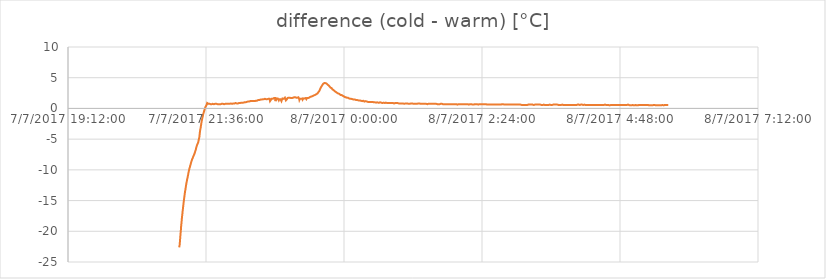
| Category | difference (cold - warm) [°C] |
|---|---|
| 42923.88056712963 | -22.62 |
| 42923.880740740744 | -22.69 |
| 42923.88092592593 | -22.19 |
| 42923.88109953704 | -21.69 |
| 42923.881273148145 | -21.19 |
| 42923.88144675926 | -20.69 |
| 42923.881631944445 | -20.19 |
| 42923.88180555555 | -19.75 |
| 42923.88197916667 | -19.19 |
| 42923.88217592592 | -18.75 |
| 42923.882361111115 | -18.31 |
| 42923.88253472222 | -17.87 |
| 42923.88270833333 | -17.5 |
| 42923.88290509259 | -17.12 |
| 42923.88309027778 | -16.69 |
| 42923.883263888885 | -16.37 |
| 42923.8834375 | -16 |
| 42923.88363425926 | -15.63 |
| 42923.88381944445 | -15.25 |
| 42923.883993055555 | -14.94 |
| 42923.88416666666 | -14.63 |
| 42923.884363425925 | -14.31 |
| 42923.88454861111 | -14 |
| 42923.884722222225 | -13.69 |
| 42923.88489583333 | -13.44 |
| 42923.88506944444 | -13.25 |
| 42923.88525462963 | -12.94 |
| 42923.88542824074 | -12.69 |
| 42923.88560185185 | -12.44 |
| 42923.885787037034 | -12.19 |
| 42923.88596064815 | -12 |
| 42923.88613425926 | -11.81 |
| 42923.88630787037 | -11.56 |
| 42923.88649305556 | -11.44 |
| 42923.886666666665 | -11.25 |
| 42923.88684027778 | -11 |
| 42923.887037037035 | -10.81 |
| 42923.88722222222 | -10.56 |
| 42923.887395833335 | -10.38 |
| 42923.88756944444 | -10.19 |
| 42923.887766203705 | -10 |
| 42923.88795138889 | -9.81 |
| 42923.888125 | -9.69 |
| 42923.88829861111 | -9.56 |
| 42923.8884837963 | -9.38 |
| 42923.888657407406 | -9.25 |
| 42923.88883101852 | -9.13 |
| 42923.88900462963 | -9 |
| 42923.889189814814 | -8.81 |
| 42923.88936342593 | -8.69 |
| 42923.88953703704 | -8.56 |
| 42923.889710648145 | -8.44 |
| 42923.88989583333 | -8.31 |
| 42923.890069444446 | -8.25 |
| 42923.89024305555 | -8.19 |
| 42923.89042824074 | -8.06 |
| 42923.890601851854 | -7.94 |
| 42923.89077546296 | -7.81 |
| 42923.89094907408 | -7.75 |
| 42923.89113425926 | -7.69 |
| 42923.89130787037 | -7.56 |
| 42923.89148148148 | -7.5 |
| 42923.89165509259 | -7.37 |
| 42923.89184027778 | -7.31 |
| 42923.892013888886 | -7.12 |
| 42923.8921875 | -7 |
| 42923.892372685186 | -6.87 |
| 42923.892546296294 | -6.75 |
| 42923.89271990741 | -6.62 |
| 42923.892916666664 | -6.37 |
| 42923.89310185185 | -6.31 |
| 42923.893275462964 | -6.12 |
| 42923.89344907407 | -6 |
| 42923.893645833334 | -5.87 |
| 42923.893842592595 | -5.81 |
| 42923.89402777778 | -5.69 |
| 42923.89420138889 | -5.56 |
| 42923.894375 | -5.5 |
| 42923.89454861111 | -5.31 |
| 42923.894733796296 | -5.19 |
| 42923.894907407404 | -4.94 |
| 42923.89509259259 | -4.75 |
| 42923.895266203705 | -4.56 |
| 42923.89543981481 | -4.12 |
| 42923.89561342593 | -3.81 |
| 42923.89579861111 | -3.5 |
| 42923.89597222222 | -3.31 |
| 42923.896145833336 | -3.12 |
| 42923.89634259259 | -2.81 |
| 42923.896516203706 | -2.56 |
| 42923.896689814814 | -2.31 |
| 42923.896886574075 | -2.06 |
| 42923.89707175926 | -1.87 |
| 42923.89724537037 | -1.69 |
| 42923.89741898148 | -1.5 |
| 42923.89760416667 | -1.31 |
| 42923.89778935185 | -1.12 |
| 42923.89796296296 | -0.94 |
| 42923.89815972222 | -0.81 |
| 42923.89834490741 | -0.69 |
| 42923.898518518516 | -0.5 |
| 42923.8987037037 | -0.37 |
| 42923.898888888885 | -0.25 |
| 42923.8990625 | -0.13 |
| 42923.89923611111 | 0 |
| 42923.899409722224 | 0.13 |
| 42923.89959490741 | 0.25 |
| 42923.89976851852 | 0.25 |
| 42923.89994212963 | 0.31 |
| 42923.90012731482 | 0.44 |
| 42923.9003125 | 0.5 |
| 42923.90048611111 | 0.62 |
| 42923.900671296295 | 0.75 |
| 42923.900868055556 | 0.88 |
| 42923.901041666664 | 0.94 |
| 42923.90121527778 | 0.88 |
| 42923.90138888889 | 0.81 |
| 42923.90157407407 | 0.75 |
| 42923.90175925926 | 0.75 |
| 42923.90193287037 | 0.75 |
| 42923.90211805556 | 0.75 |
| 42923.902291666665 | 0.75 |
| 42923.90246527778 | 0.75 |
| 42923.902662037035 | 0.75 |
| 42923.9028587963 | 0.75 |
| 42923.90304398148 | 0.69 |
| 42923.90321759259 | 0.69 |
| 42923.903391203705 | 0.69 |
| 42923.90357638889 | 0.69 |
| 42923.903761574074 | 0.69 |
| 42923.90393518518 | 0.69 |
| 42923.90412037037 | 0.69 |
| 42923.90430555555 | 0.69 |
| 42923.904490740744 | 0.69 |
| 42923.90466435185 | 0.75 |
| 42923.90484953704 | 0.75 |
| 42923.905023148145 | 0.69 |
| 42923.90519675926 | 0.69 |
| 42923.90539351852 | 0.69 |
| 42923.90556712963 | 0.69 |
| 42923.90574074074 | 0.69 |
| 42923.9059375 | 0.75 |
| 42923.90611111111 | 0.75 |
| 42923.90628472222 | 0.69 |
| 42923.90645833333 | 0.75 |
| 42923.906643518516 | 0.75 |
| 42923.90681712963 | 0.75 |
| 42923.907002314816 | 0.75 |
| 42923.907175925924 | 0.75 |
| 42923.90734953704 | 0.75 |
| 42923.90752314815 | 0.75 |
| 42923.90771990741 | 0.75 |
| 42923.90789351852 | 0.75 |
| 42923.90806712963 | 0.75 |
| 42923.90824074074 | 0.75 |
| 42923.9084375 | 0.69 |
| 42923.90862268519 | 0.69 |
| 42923.908796296295 | 0.69 |
| 42923.90896990741 | 0.69 |
| 42923.909166666665 | 0.69 |
| 42923.90935185185 | 0.69 |
| 42923.909525462965 | 0.69 |
| 42923.90969907407 | 0.69 |
| 42923.909895833334 | 0.69 |
| 42923.91008101852 | 0.69 |
| 42923.91025462963 | 0.69 |
| 42923.91042824074 | 0.69 |
| 42923.910625 | 0.69 |
| 42923.91081018518 | 0.69 |
| 42923.9109837963 | 0.69 |
| 42923.91118055556 | 0.75 |
| 42923.91136574074 | 0.75 |
| 42923.91153935185 | 0.75 |
| 42923.91171296296 | 0.75 |
| 42923.911886574075 | 0.75 |
| 42923.91207175926 | 0.69 |
| 42923.91224537037 | 0.75 |
| 42923.91241898148 | 0.75 |
| 42923.91259259259 | 0.69 |
| 42923.91278935185 | 0.69 |
| 42923.91296296296 | 0.75 |
| 42923.91315972222 | 0.69 |
| 42923.91334490741 | 0.69 |
| 42923.913518518515 | 0.69 |
| 42923.91369212963 | 0.75 |
| 42923.91386574074 | 0.69 |
| 42923.91405092592 | 0.75 |
| 42923.91422453704 | 0.75 |
| 42923.91439814815 | 0.75 |
| 42923.91457175926 | 0.75 |
| 42923.91475694445 | 0.75 |
| 42923.914930555555 | 0.75 |
| 42923.915127314816 | 0.75 |
| 42923.915300925924 | 0.69 |
| 42923.91548611111 | 0.75 |
| 42923.91568287037 | 0.75 |
| 42923.91585648148 | 0.75 |
| 42923.916041666664 | 0.75 |
| 42923.91622685185 | 0.75 |
| 42923.91641203704 | 0.75 |
| 42923.916597222225 | 0.75 |
| 42923.91678240741 | 0.75 |
| 42923.916967592595 | 0.75 |
| 42923.9171412037 | 0.75 |
| 42923.91732638889 | 0.75 |
| 42923.9175 | 0.75 |
| 42923.91767361111 | 0.81 |
| 42923.91784722222 | 0.81 |
| 42923.918020833335 | 0.81 |
| 42923.91819444444 | 0.75 |
| 42923.91836805556 | 0.81 |
| 42923.918541666666 | 0.81 |
| 42923.91871527778 | 0.75 |
| 42923.918900462966 | 0.75 |
| 42923.919074074074 | 0.75 |
| 42923.91924768518 | 0.75 |
| 42923.91943287037 | 0.75 |
| 42923.91961805556 | 0.81 |
| 42923.91979166667 | 0.81 |
| 42923.919965277775 | 0.75 |
| 42923.92015046296 | 0.81 |
| 42923.920324074075 | 0.81 |
| 42923.92050925926 | 0.81 |
| 42923.92068287037 | 0.81 |
| 42923.92087962963 | 0.81 |
| 42923.921064814815 | 0.81 |
| 42923.92123842592 | 0.81 |
| 42923.92141203704 | 0.88 |
| 42923.921585648146 | 0.81 |
| 42923.92175925926 | 0.88 |
| 42923.92193287037 | 0.81 |
| 42923.922106481485 | 0.81 |
| 42923.92229166667 | 0.81 |
| 42923.92246527778 | 0.81 |
| 42923.922638888886 | 0.81 |
| 42923.9228125 | 0.75 |
| 42923.92298611111 | 0.81 |
| 42923.923171296294 | 0.81 |
| 42923.92335648148 | 0.81 |
| 42923.92355324074 | 0.81 |
| 42923.923738425925 | 0.81 |
| 42923.92392361111 | 0.88 |
| 42923.92412037037 | 0.88 |
| 42923.924305555556 | 0.88 |
| 42923.924479166664 | 0.88 |
| 42923.92465277778 | 0.88 |
| 42923.924849537034 | 0.81 |
| 42923.92502314815 | 0.81 |
| 42923.92519675926 | 0.88 |
| 42923.92537037037 | 0.94 |
| 42923.92556712963 | 0.94 |
| 42923.92575231481 | 0.94 |
| 42923.92592592593 | 0.94 |
| 42923.926099537035 | 0.94 |
| 42923.9262962963 | 0.94 |
| 42923.92649305556 | 0.94 |
| 42923.92667824074 | 0.94 |
| 42923.92685185185 | 0.94 |
| 42923.92704861111 | 0.94 |
| 42923.9272337963 | 1 |
| 42923.927407407406 | 1 |
| 42923.92758101852 | 1 |
| 42923.92775462963 | 1 |
| 42923.927928240744 | 1 |
| 42923.92810185185 | 1 |
| 42923.928298611114 | 1 |
| 42923.9284837963 | 1 |
| 42923.92865740741 | 1 |
| 42923.92883101852 | 1 |
| 42923.92901620371 | 1 |
| 42923.92920138889 | 1.06 |
| 42923.929375 | 1.06 |
| 42923.92957175926 | 1.06 |
| 42923.929756944446 | 1.06 |
| 42923.929930555554 | 1.12 |
| 42923.93011574074 | 1.12 |
| 42923.930300925924 | 1.12 |
| 42923.93047453704 | 1.12 |
| 42923.93064814815 | 1.12 |
| 42923.93082175926 | 1.06 |
| 42923.93099537037 | 1.06 |
| 42923.93116898148 | 1.12 |
| 42923.931342592594 | 1.12 |
| 42923.93152777778 | 1.12 |
| 42923.93170138889 | 1.12 |
| 42923.931875 | 1.12 |
| 42923.932071759256 | 1.19 |
| 42923.93225694444 | 1.12 |
| 42923.93243055556 | 1.12 |
| 42923.932604166665 | 1.12 |
| 42923.93278935185 | 1.12 |
| 42923.932962962965 | 1.19 |
| 42923.93313657407 | 1.19 |
| 42923.93331018519 | 1.19 |
| 42923.93350694444 | 1.19 |
| 42923.93369212963 | 1.19 |
| 42923.93386574074 | 1.19 |
| 42923.93403935185 | 1.19 |
| 42923.934224537035 | 1.19 |
| 42923.93439814815 | 1.19 |
| 42923.93457175926 | 1.19 |
| 42923.93476851852 | 1.19 |
| 42923.93493055556 | 1.25 |
| 42923.93510416667 | 1.25 |
| 42923.93530092593 | 1.19 |
| 42923.93548611111 | 1.19 |
| 42923.93565972222 | 1.25 |
| 42923.93583333334 | 1.25 |
| 42923.936006944445 | 1.25 |
| 42923.93618055555 | 1.25 |
| 42923.93636574074 | 1.25 |
| 42923.93653935185 | 1.25 |
| 42923.93672453704 | 1.25 |
| 42923.93690972222 | 1.25 |
| 42923.93709490741 | 1.25 |
| 42923.937268518515 | 1.25 |
| 42923.9374537037 | 1.31 |
| 42923.937627314815 | 1.31 |
| 42923.93780092592 | 1.37 |
| 42923.93797453704 | 1.31 |
| 42923.938159722224 | 1.31 |
| 42923.93833333333 | 1.37 |
| 42923.93850694445 | 1.37 |
| 42923.93869212963 | 1.37 |
| 42923.93886574074 | 1.44 |
| 42923.939039351855 | 1.44 |
| 42923.93921296296 | 1.5 |
| 42923.93938657407 | 1.44 |
| 42923.939571759256 | 1.44 |
| 42923.93974537037 | 1.5 |
| 42923.93991898148 | 1.5 |
| 42923.940104166664 | 1.44 |
| 42923.94027777778 | 1.44 |
| 42923.94045138889 | 1.44 |
| 42923.94064814815 | 1.5 |
| 42923.940833333334 | 1.5 |
| 42923.94101851852 | 1.44 |
| 42923.941203703704 | 1.5 |
| 42923.941400462965 | 1.5 |
| 42923.94158564815 | 1.5 |
| 42923.94175925926 | 1.44 |
| 42923.94193287037 | 1.5 |
| 42923.94212962963 | 1.5 |
| 42923.94231481481 | 1.5 |
| 42923.94248842593 | 1.5 |
| 42923.942662037036 | 1.56 |
| 42923.94284722222 | 1.5 |
| 42923.943020833336 | 1.5 |
| 42923.943194444444 | 1.5 |
| 42923.94336805555 | 1.5 |
| 42923.943553240744 | 1.5 |
| 42923.94372685185 | 1.44 |
| 42923.94390046296 | 1.5 |
| 42923.94409722222 | 1.5 |
| 42923.94428240741 | 1.5 |
| 42923.94445601852 | 1.44 |
| 42923.94462962963 | 1.5 |
| 42923.94480324074 | 1.5 |
| 42923.94498842592 | 1.5 |
| 42923.94516203704 | 1.56 |
| 42923.945335648146 | 1.5 |
| 42923.94550925926 | 1.5 |
| 42923.94569444445 | 1.56 |
| 42923.945868055554 | 1.56 |
| 42923.94604166667 | 1.56 |
| 42923.94621527778 | 1.56 |
| 42923.94640046296 | 1.19 |
| 42923.94658564815 | 1.25 |
| 42923.94677083333 | 1.31 |
| 42923.94694444445 | 1.37 |
| 42923.94712962963 | 1.44 |
| 42923.94731481482 | 1.5 |
| 42923.9475 | 1.56 |
| 42923.94767361111 | 1.5 |
| 42923.947858796295 | 1.56 |
| 42923.94803240741 | 1.56 |
| 42923.94820601852 | 1.62 |
| 42923.948379629626 | 1.56 |
| 42923.94856481482 | 1.62 |
| 42923.94873842593 | 1.69 |
| 42923.948912037034 | 1.69 |
| 42923.94908564815 | 1.69 |
| 42923.949270833335 | 1.69 |
| 42923.94944444444 | 1.69 |
| 42923.94961805556 | 1.69 |
| 42923.949791666666 | 1.62 |
| 42923.94997685185 | 1.69 |
| 42923.950150462966 | 1.69 |
| 42923.950324074074 | 1.19 |
| 42923.950520833336 | 1.25 |
| 42923.95070601852 | 1.44 |
| 42923.95087962963 | 1.5 |
| 42923.951053240744 | 1.56 |
| 42923.95123842593 | 1.62 |
| 42923.95143518518 | 1.62 |
| 42923.9516087963 | 1.62 |
| 42923.95178240741 | 1.69 |
| 42923.95197916667 | 1.62 |
| 42923.95217592592 | 1.69 |
| 42923.952361111114 | 1.75 |
| 42923.95253472222 | 1.56 |
| 42923.952731481484 | 1.31 |
| 42923.95291666667 | 1.44 |
| 42923.95309027778 | 1.5 |
| 42923.95326388889 | 1.56 |
| 42923.9534375 | 1.62 |
| 42923.95361111111 | 1.62 |
| 42923.95379629629 | 1.5 |
| 42923.95396990741 | 1.5 |
| 42923.95415509259 | 1.62 |
| 42923.9543287037 | 1.62 |
| 42923.95450231482 | 1.44 |
| 42923.954675925925 | 1.19 |
| 42923.954872685186 | 1.31 |
| 42923.95505787037 | 1.44 |
| 42923.95523148148 | 1.56 |
| 42923.955405092594 | 1.62 |
| 42923.95559027778 | 1.69 |
| 42923.95576388889 | 1.62 |
| 42923.9559375 | 1.69 |
| 42923.95612268519 | 1.56 |
| 42923.956296296295 | 1.56 |
| 42923.95646990741 | 1.62 |
| 42923.95664351852 | 1.62 |
| 42923.956828703704 | 1.69 |
| 42923.95700231481 | 1.69 |
| 42923.95717592593 | 1.75 |
| 42923.95737268519 | 1.69 |
| 42923.95755787037 | 1.69 |
| 42923.95773148148 | 1.75 |
| 42923.95790509259 | 1.31 |
| 42923.95810185185 | 1.25 |
| 42923.958287037036 | 1.37 |
| 42923.95846064815 | 1.44 |
| 42923.95863425926 | 1.5 |
| 42923.95883101852 | 1.62 |
| 42923.959016203706 | 1.69 |
| 42923.959189814814 | 1.69 |
| 42923.95936342593 | 1.69 |
| 42923.95953703704 | 1.62 |
| 42923.95972222222 | 1.69 |
| 42923.95990740741 | 1.75 |
| 42923.96009259259 | 1.75 |
| 42923.960277777776 | 1.75 |
| 42923.96045138889 | 1.75 |
| 42923.960625 | 1.75 |
| 42923.96079861111 | 1.75 |
| 42923.9609837963 | 1.75 |
| 42923.96115740741 | 1.62 |
| 42923.961331018516 | 1.62 |
| 42923.96152777778 | 1.69 |
| 42923.96171296296 | 1.69 |
| 42923.96189814815 | 1.62 |
| 42923.96208333333 | 1.69 |
| 42923.96225694445 | 1.69 |
| 42923.96244212963 | 1.75 |
| 42923.96261574074 | 1.75 |
| 42923.962789351855 | 1.69 |
| 42923.96296296296 | 1.75 |
| 42923.96314814815 | 1.75 |
| 42923.963321759256 | 1.75 |
| 42923.96349537037 | 1.69 |
| 42923.963692129626 | 1.75 |
| 42923.96387731482 | 1.81 |
| 42923.964050925926 | 1.81 |
| 42923.964224537034 | 1.81 |
| 42923.96440972222 | 1.81 |
| 42923.964583333334 | 1.81 |
| 42923.96475694444 | 1.81 |
| 42923.964953703704 | 1.81 |
| 42923.96513888889 | 1.81 |
| 42923.9653125 | 1.81 |
| 42923.96548611111 | 1.75 |
| 42923.965682870374 | 1.69 |
| 42923.96586805556 | 1.75 |
| 42923.96604166667 | 1.75 |
| 42923.966215277775 | 1.75 |
| 42923.966412037036 | 1.75 |
| 42923.96659722222 | 1.81 |
| 42923.966782407406 | 1.75 |
| 42923.96696759259 | 1.81 |
| 42923.967141203706 | 1.81 |
| 42923.96732638889 | 1.81 |
| 42923.9675 | 1.56 |
| 42923.967673611114 | 1.37 |
| 42923.96787037037 | 1.5 |
| 42923.96805555555 | 1.56 |
| 42923.96822916667 | 1.56 |
| 42923.96840277778 | 1.62 |
| 42923.96858796296 | 1.62 |
| 42923.96876157408 | 1.62 |
| 42923.968935185185 | 1.56 |
| 42923.96910879629 | 1.62 |
| 42923.969293981485 | 1.62 |
| 42923.96946759259 | 1.69 |
| 42923.9696412037 | 1.56 |
| 42923.96983796296 | 1.62 |
| 42923.97002314815 | 1.44 |
| 42923.97019675926 | 1.5 |
| 42923.97037037037 | 1.56 |
| 42923.97056712963 | 1.62 |
| 42923.97075231482 | 1.62 |
| 42923.9709375 | 1.69 |
| 42923.97109953704 | 1.62 |
| 42923.971296296295 | 1.62 |
| 42923.97148148148 | 1.62 |
| 42923.971655092595 | 1.69 |
| 42923.9718287037 | 1.69 |
| 42923.97201388889 | 1.75 |
| 42923.9721875 | 1.69 |
| 42923.97236111111 | 1.62 |
| 42923.97253472222 | 1.56 |
| 42923.972719907404 | 1.5 |
| 42923.97289351852 | 1.62 |
| 42923.97306712963 | 1.62 |
| 42923.97326388889 | 1.69 |
| 42923.973449074074 | 1.69 |
| 42923.97362268518 | 1.75 |
| 42923.9737962963 | 1.75 |
| 42923.97399305556 | 1.69 |
| 42923.974178240744 | 1.75 |
| 42923.97435185185 | 1.75 |
| 42923.97452546296 | 1.75 |
| 42923.97472222222 | 1.75 |
| 42923.974907407406 | 1.81 |
| 42923.97510416667 | 1.81 |
| 42923.975277777776 | 1.87 |
| 42923.97546296296 | 1.87 |
| 42923.975636574076 | 1.87 |
| 42923.975810185184 | 1.87 |
| 42923.9759837963 | 1.87 |
| 42923.976168981484 | 1.94 |
| 42923.97634259259 | 1.94 |
| 42923.9765162037 | 1.94 |
| 42923.97670138889 | 2 |
| 42923.976875 | 1.94 |
| 42923.97704861111 | 2.06 |
| 42923.977222222224 | 2 |
| 42923.97740740741 | 2 |
| 42923.97758101852 | 2.06 |
| 42923.97775462963 | 2.06 |
| 42923.97792824074 | 2.06 |
| 42923.978113425925 | 2.12 |
| 42923.97828703704 | 2.12 |
| 42923.97846064815 | 2.12 |
| 42923.97864583333 | 2.12 |
| 42923.97881944444 | 2.19 |
| 42923.978993055556 | 2.19 |
| 42923.979166666664 | 2.19 |
| 42923.97935185185 | 2.19 |
| 42923.979525462964 | 2.25 |
| 42923.97969907407 | 2.25 |
| 42923.979895833334 | 2.31 |
| 42923.98008101852 | 2.31 |
| 42923.98025462963 | 2.37 |
| 42923.98042824074 | 2.37 |
| 42923.98061342593 | 2.44 |
| 42923.980787037035 | 2.44 |
| 42923.98096064815 | 2.5 |
| 42923.98113425926 | 2.56 |
| 42923.98131944444 | 2.62 |
| 42923.98149305556 | 2.69 |
| 42923.98166666667 | 2.69 |
| 42923.981840277775 | 2.75 |
| 42923.982037037036 | 2.81 |
| 42923.98222222222 | 2.94 |
| 42923.982395833336 | 3 |
| 42923.982569444444 | 3.12 |
| 42923.98274305555 | 3.19 |
| 42923.98292824074 | 3.25 |
| 42923.98310185185 | 3.31 |
| 42923.98328703704 | 3.44 |
| 42923.983460648145 | 3.5 |
| 42923.98363425926 | 3.56 |
| 42923.98380787037 | 3.62 |
| 42923.98399305555 | 3.75 |
| 42923.98416666667 | 3.75 |
| 42923.98434027778 | 3.81 |
| 42923.98453703704 | 3.87 |
| 42923.98472222222 | 3.94 |
| 42923.98489583333 | 4 |
| 42923.98506944445 | 4 |
| 42923.9852662037 | 4 |
| 42923.98546296296 | 4.06 |
| 42923.98564814815 | 4.12 |
| 42923.98582175926 | 4.12 |
| 42923.98599537037 | 4.12 |
| 42923.98616898148 | 4.12 |
| 42923.986354166664 | 4.12 |
| 42923.98652777778 | 4.12 |
| 42923.98672453704 | 4.12 |
| 42923.98689814815 | 4.12 |
| 42923.98708333333 | 4.12 |
| 42923.98725694444 | 4.06 |
| 42923.987442129626 | 4 |
| 42923.98761574074 | 4 |
| 42923.98778935185 | 3.94 |
| 42923.987962962965 | 3.94 |
| 42923.98814814815 | 3.87 |
| 42923.98832175926 | 3.81 |
| 42923.98849537037 | 3.81 |
| 42923.98869212963 | 3.75 |
| 42923.98887731481 | 3.75 |
| 42923.98905092593 | 3.69 |
| 42923.989224537036 | 3.62 |
| 42923.98939814815 | 3.62 |
| 42923.989583333336 | 3.56 |
| 42923.989756944444 | 3.5 |
| 42923.98993055556 | 3.5 |
| 42923.99012731481 | 3.44 |
| 42923.9903125 | 3.37 |
| 42923.99048611111 | 3.37 |
| 42923.99065972222 | 3.31 |
| 42923.99085648148 | 3.25 |
| 42923.99104166667 | 3.31 |
| 42923.991215277776 | 3.25 |
| 42923.99138888889 | 3.19 |
| 42923.9915625 | 3.12 |
| 42923.99175925926 | 3.12 |
| 42923.991944444446 | 3.06 |
| 42923.992118055554 | 3.06 |
| 42923.992314814815 | 3 |
| 42923.9925 | 2.94 |
| 42923.99267361111 | 2.94 |
| 42923.992847222224 | 2.87 |
| 42923.99303240741 | 2.87 |
| 42923.99320601852 | 2.81 |
| 42923.99337962963 | 2.75 |
| 42923.99355324074 | 2.75 |
| 42923.993738425925 | 2.75 |
| 42923.99391203704 | 2.69 |
| 42923.99408564815 | 2.69 |
| 42923.99428240741 | 2.62 |
| 42923.994479166664 | 2.62 |
| 42923.99466435185 | 2.56 |
| 42923.994837962964 | 2.56 |
| 42923.99501157407 | 2.56 |
| 42923.99519675926 | 2.5 |
| 42923.99537037037 | 2.5 |
| 42923.99554398148 | 2.44 |
| 42923.995717592596 | 2.44 |
| 42923.99590277778 | 2.37 |
| 42923.99607638889 | 2.37 |
| 42923.99625 | 2.37 |
| 42923.99642361111 | 2.37 |
| 42923.99663194444 | 2.37 |
| 42923.99680555556 | 2.25 |
| 42923.996979166666 | 2.25 |
| 42923.997152777774 | 2.25 |
| 42923.99733796297 | 2.25 |
| 42923.997511574074 | 2.19 |
| 42923.99768518518 | 2.19 |
| 42923.997881944444 | 2.19 |
| 42923.998078703706 | 2.19 |
| 42923.99826388889 | 2.19 |
| 42923.9984375 | 2.12 |
| 42923.99863425926 | 2.06 |
| 42923.998819444445 | 2.06 |
| 42923.99899305555 | 2.06 |
| 42923.99916666667 | 2.06 |
| 42923.99936342592 | 2 |
| 42923.999548611115 | 2 |
| 42923.99972222222 | 2 |
| 42923.99989583333 | 1.94 |
| 42924.00009259259 | 1.94 |
| 42924.00027777778 | 1.94 |
| 42924.000451388885 | 1.87 |
| 42924.000625 | 1.87 |
| 42924.00079861111 | 1.87 |
| 42924.00098379629 | 1.87 |
| 42924.00115740741 | 1.87 |
| 42924.00135416666 | 1.81 |
| 42924.001539351855 | 1.81 |
| 42924.00171296296 | 1.81 |
| 42924.00188657407 | 1.81 |
| 42924.00208333333 | 1.75 |
| 42924.00226851852 | 1.75 |
| 42924.00244212963 | 1.75 |
| 42924.00261574074 | 1.75 |
| 42924.0028125 | 1.75 |
| 42924.00299768519 | 1.69 |
| 42924.003171296295 | 1.69 |
| 42924.00334490741 | 1.69 |
| 42924.00351851852 | 1.69 |
| 42924.003703703704 | 1.62 |
| 42924.00387731481 | 1.62 |
| 42924.00405092593 | 1.62 |
| 42924.00423611111 | 1.62 |
| 42924.00440972222 | 1.62 |
| 42924.004583333335 | 1.56 |
| 42924.00475694444 | 1.56 |
| 42924.004953703705 | 1.56 |
| 42924.00513888889 | 1.56 |
| 42924.0053125 | 1.56 |
| 42924.00548611111 | 1.5 |
| 42924.00565972222 | 1.56 |
| 42924.005844907406 | 1.5 |
| 42924.00601851852 | 1.56 |
| 42924.00619212963 | 1.5 |
| 42924.006377314814 | 1.44 |
| 42924.00655092593 | 1.5 |
| 42924.00672453704 | 1.44 |
| 42924.00690972222 | 1.44 |
| 42924.00708333333 | 1.44 |
| 42924.007256944446 | 1.44 |
| 42924.00743055555 | 1.44 |
| 42924.00761574074 | 1.44 |
| 42924.007789351854 | 1.37 |
| 42924.00796296296 | 1.44 |
| 42924.00813657408 | 1.37 |
| 42924.00832175926 | 1.44 |
| 42924.00849537037 | 1.37 |
| 42924.00869212963 | 1.37 |
| 42924.008877314816 | 1.37 |
| 42924.009050925924 | 1.37 |
| 42924.00922453704 | 1.31 |
| 42924.00939814815 | 1.31 |
| 42924.00958333333 | 1.37 |
| 42924.00975694445 | 1.31 |
| 42924.009930555556 | 1.31 |
| 42924.01011574074 | 1.31 |
| 42924.01028935185 | 1.31 |
| 42924.010462962964 | 1.31 |
| 42924.01063657407 | 1.25 |
| 42924.01082175926 | 1.31 |
| 42924.01099537037 | 1.25 |
| 42924.01116898148 | 1.25 |
| 42924.01136574074 | 1.31 |
| 42924.01155092593 | 1.25 |
| 42924.011724537035 | 1.25 |
| 42924.01189814815 | 1.25 |
| 42924.01207175926 | 1.25 |
| 42924.01225694444 | 1.25 |
| 42924.01243055556 | 1.25 |
| 42924.012604166666 | 1.25 |
| 42924.012777777774 | 1.25 |
| 42924.01296296297 | 1.25 |
| 42924.013136574074 | 1.19 |
| 42924.01331018518 | 1.25 |
| 42924.01349537037 | 1.19 |
| 42924.01366898148 | 1.19 |
| 42924.01384259259 | 1.25 |
| 42924.014016203706 | 1.25 |
| 42924.01420138889 | 1.19 |
| 42924.014375 | 1.19 |
| 42924.014548611114 | 1.19 |
| 42924.01474537037 | 1.12 |
| 42924.01493055555 | 1.19 |
| 42924.01510416667 | 1.19 |
| 42924.01527777778 | 1.12 |
| 42924.01545138889 | 1.12 |
| 42924.01563657408 | 1.19 |
| 42924.015810185185 | 1.12 |
| 42924.01598379629 | 1.12 |
| 42924.016168981485 | 1.12 |
| 42924.01634259259 | 1.12 |
| 42924.0165162037 | 1.12 |
| 42924.016689814816 | 1.12 |
| 42924.016875 | 1.12 |
| 42924.01704861111 | 1.19 |
| 42924.017222222225 | 1.12 |
| 42924.01739583333 | 1.06 |
| 42924.01758101852 | 1.12 |
| 42924.01775462963 | 1.12 |
| 42924.01792824074 | 1.12 |
| 42924.018113425926 | 1.12 |
| 42924.01828703703 | 1.06 |
| 42924.01846064815 | 1.12 |
| 42924.018645833334 | 1.12 |
| 42924.01881944444 | 1.06 |
| 42924.01899305556 | 1.06 |
| 42924.019166666665 | 1.06 |
| 42924.01935185185 | 1.12 |
| 42924.019537037035 | 1.06 |
| 42924.01972222222 | 1.06 |
| 42924.019895833335 | 1.06 |
| 42924.02008101852 | 1.06 |
| 42924.02025462963 | 1 |
| 42924.02042824074 | 1 |
| 42924.02060185185 | 1.06 |
| 42924.020787037036 | 1.06 |
| 42924.02096064815 | 1.06 |
| 42924.02113425926 | 1.06 |
| 42924.02133101852 | 1 |
| 42924.021516203706 | 1 |
| 42924.021689814814 | 1.06 |
| 42924.02186342593 | 1.06 |
| 42924.022048611114 | 1 |
| 42924.02222222222 | 1 |
| 42924.02239583333 | 1 |
| 42924.022569444445 | 1 |
| 42924.02275462963 | 1 |
| 42924.02292824074 | 1 |
| 42924.02310185185 | 1 |
| 42924.02327546296 | 0.94 |
| 42924.023460648146 | 1 |
| 42924.02363425926 | 1 |
| 42924.02380787037 | 1 |
| 42924.02400462963 | 1 |
| 42924.024189814816 | 1 |
| 42924.024363425924 | 0.94 |
| 42924.02453703704 | 0.94 |
| 42924.024733796294 | 0.94 |
| 42924.02491898148 | 0.94 |
| 42924.02510416666 | 1 |
| 42924.025289351855 | 0.94 |
| 42924.02546296296 | 0.94 |
| 42924.02564814815 | 0.94 |
| 42924.025821759256 | 0.94 |
| 42924.02599537037 | 1 |
| 42924.026192129626 | 1 |
| 42924.02637731482 | 0.88 |
| 42924.026550925926 | 0.88 |
| 42924.026724537034 | 0.94 |
| 42924.026921296296 | 0.94 |
| 42924.02710648148 | 0.94 |
| 42924.027280092596 | 0.94 |
| 42924.027453703704 | 0.94 |
| 42924.02763888889 | 0.88 |
| 42924.02782407407 | 0.88 |
| 42924.02798611111 | 0.88 |
| 42924.02815972222 | 0.94 |
| 42924.028344907405 | 0.94 |
| 42924.02851851852 | 0.94 |
| 42924.02869212963 | 0.94 |
| 42924.028865740744 | 0.94 |
| 42924.02905092593 | 0.88 |
| 42924.02922453704 | 0.88 |
| 42924.029398148145 | 0.88 |
| 42924.029594907406 | 0.88 |
| 42924.02978009259 | 0.94 |
| 42924.029953703706 | 0.94 |
| 42924.030127314814 | 0.94 |
| 42924.030324074076 | 0.94 |
| 42924.03050925926 | 0.94 |
| 42924.03068287037 | 0.88 |
| 42924.030856481484 | 0.88 |
| 42924.03103009259 | 0.88 |
| 42924.03121527778 | 0.88 |
| 42924.03138888889 | 0.88 |
| 42924.0315625 | 0.94 |
| 42924.03175925926 | 0.88 |
| 42924.03192129629 | 0.88 |
| 42924.03209490741 | 0.88 |
| 42924.03226851852 | 0.88 |
| 42924.0324537037 | 0.88 |
| 42924.03262731482 | 0.88 |
| 42924.032800925925 | 0.88 |
| 42924.03297453704 | 0.88 |
| 42924.033159722225 | 0.88 |
| 42924.03333333333 | 0.88 |
| 42924.03350694444 | 0.88 |
| 42924.0337037037 | 0.88 |
| 42924.03388888889 | 0.88 |
| 42924.0340625 | 0.81 |
| 42924.03423611111 | 0.88 |
| 42924.034421296295 | 0.81 |
| 42924.03459490741 | 0.88 |
| 42924.03476851852 | 0.81 |
| 42924.03494212963 | 0.81 |
| 42924.03512731481 | 0.88 |
| 42924.03530092593 | 0.88 |
| 42924.035474537035 | 0.88 |
| 42924.03565972222 | 0.88 |
| 42924.035833333335 | 0.88 |
| 42924.03600694444 | 0.88 |
| 42924.03618055556 | 0.94 |
| 42924.03636574074 | 0.81 |
| 42924.03653935185 | 0.81 |
| 42924.03671296296 | 0.88 |
| 42924.03690972222 | 0.88 |
| 42924.037094907406 | 0.88 |
| 42924.03726851852 | 0.88 |
| 42924.03744212963 | 0.88 |
| 42924.03761574074 | 0.88 |
| 42924.03780092593 | 0.88 |
| 42924.03797453704 | 0.88 |
| 42924.038148148145 | 0.88 |
| 42924.03833333333 | 0.88 |
| 42924.038506944446 | 0.88 |
| 42924.03868055555 | 0.81 |
| 42924.038877314815 | 0.88 |
| 42924.0390625 | 0.81 |
| 42924.03923611111 | 0.81 |
| 42924.03940972222 | 0.81 |
| 42924.03959490741 | 0.81 |
| 42924.039768518516 | 0.81 |
| 42924.03994212963 | 0.88 |
| 42924.04011574074 | 0.81 |
| 42924.040300925924 | 0.81 |
| 42924.04047453704 | 0.88 |
| 42924.04064814815 | 0.81 |
| 42924.04084490741 | 0.81 |
| 42924.041030092594 | 0.81 |
| 42924.0412037037 | 0.81 |
| 42924.04137731482 | 0.81 |
| 42924.0415625 | 0.81 |
| 42924.04174768519 | 0.81 |
| 42924.04193287037 | 0.81 |
| 42924.04210648148 | 0.81 |
| 42924.04230324074 | 0.81 |
| 42924.04248842593 | 0.81 |
| 42924.042662037034 | 0.81 |
| 42924.04283564815 | 0.81 |
| 42924.043020833335 | 0.81 |
| 42924.04319444444 | 0.81 |
| 42924.04336805556 | 0.81 |
| 42924.043541666666 | 0.75 |
| 42924.04372685185 | 0.75 |
| 42924.043900462966 | 0.75 |
| 42924.044074074074 | 0.88 |
| 42924.044270833336 | 0.81 |
| 42924.04445601852 | 0.81 |
| 42924.04462962963 | 0.81 |
| 42924.044803240744 | 0.81 |
| 42924.045 | 0.81 |
| 42924.04519675926 | 0.81 |
| 42924.045381944445 | 0.81 |
| 42924.04555555555 | 0.81 |
| 42924.04572916667 | 0.81 |
| 42924.04592592592 | 0.81 |
| 42924.046111111114 | 0.81 |
| 42924.04628472222 | 0.81 |
| 42924.04645833333 | 0.81 |
| 42924.046631944446 | 0.75 |
| 42924.04681712963 | 0.75 |
| 42924.04699074074 | 0.81 |
| 42924.047164351854 | 0.81 |
| 42924.04734953704 | 0.75 |
| 42924.04752314815 | 0.75 |
| 42924.04769675926 | 0.75 |
| 42924.04788194445 | 0.75 |
| 42924.048055555555 | 0.75 |
| 42924.04822916666 | 0.81 |
| 42924.04840277778 | 0.81 |
| 42924.04858796296 | 0.81 |
| 42924.04876157407 | 0.81 |
| 42924.04893518519 | 0.81 |
| 42924.049108796295 | 0.81 |
| 42924.04929398148 | 0.81 |
| 42924.049467592595 | 0.81 |
| 42924.0496412037 | 0.81 |
| 42924.04982638889 | 0.81 |
| 42924.05 | 0.81 |
| 42924.05017361111 | 0.75 |
| 42924.05034722222 | 0.75 |
| 42924.050532407404 | 0.81 |
| 42924.05070601852 | 0.81 |
| 42924.05087962963 | 0.81 |
| 42924.05105324074 | 0.75 |
| 42924.05123842593 | 0.75 |
| 42924.051412037035 | 0.75 |
| 42924.05158564815 | 0.75 |
| 42924.05175925926 | 0.75 |
| 42924.05194444444 | 0.75 |
| 42924.05211805556 | 0.75 |
| 42924.05229166667 | 0.75 |
| 42924.05248842593 | 0.75 |
| 42924.05267361111 | 0.75 |
| 42924.05284722222 | 0.75 |
| 42924.05302083334 | 0.81 |
| 42924.053194444445 | 0.81 |
| 42924.05337962963 | 0.81 |
| 42924.053564814814 | 0.75 |
| 42924.05375 | 0.81 |
| 42924.053923611114 | 0.75 |
| 42924.0541087963 | 0.81 |
| 42924.05428240741 | 0.81 |
| 42924.054456018515 | 0.81 |
| 42924.0546412037 | 0.81 |
| 42924.054814814815 | 0.75 |
| 42924.05498842592 | 0.75 |
| 42924.05516203704 | 0.75 |
| 42924.055347222224 | 0.75 |
| 42924.05552083333 | 0.75 |
| 42924.05569444445 | 0.81 |
| 42924.05587962963 | 0.75 |
| 42924.05605324074 | 0.75 |
| 42924.056226851855 | 0.75 |
| 42924.05642361111 | 0.75 |
| 42924.056608796294 | 0.75 |
| 42924.05678240741 | 0.75 |
| 42924.05695601852 | 0.75 |
| 42924.05715277778 | 0.75 |
| 42924.057337962964 | 0.75 |
| 42924.05751157407 | 0.75 |
| 42924.05768518519 | 0.75 |
| 42924.05788194444 | 0.75 |
| 42924.05804398148 | 0.75 |
| 42924.058217592596 | 0.75 |
| 42924.058391203704 | 0.75 |
| 42924.05857638889 | 0.75 |
| 42924.05875 | 0.75 |
| 42924.05892361111 | 0.75 |
| 42924.05909722222 | 0.75 |
| 42924.05931712963 | 0.75 |
| 42924.05950231481 | 0.75 |
| 42924.05967592593 | 0.75 |
| 42924.059849537036 | 0.75 |
| 42924.06003472222 | 0.69 |
| 42924.060208333336 | 0.69 |
| 42924.060381944444 | 0.69 |
| 42924.060578703706 | 0.69 |
| 42924.06076388889 | 0.69 |
| 42924.0609375 | 0.69 |
| 42924.061111111114 | 0.75 |
| 42924.06130787037 | 0.75 |
| 42924.06149305555 | 0.75 |
| 42924.06166666667 | 0.75 |
| 42924.061840277776 | 0.75 |
| 42924.06201388889 | 0.75 |
| 42924.06219907408 | 0.75 |
| 42924.062372685185 | 0.75 |
| 42924.0625462963 | 0.75 |
| 42924.062731481485 | 0.75 |
| 42924.06290509259 | 0.75 |
| 42924.0630787037 | 0.75 |
| 42924.06327546296 | 0.75 |
| 42924.06346064815 | 0.75 |
| 42924.06363425926 | 0.75 |
| 42924.06380787037 | 0.75 |
| 42924.06398148148 | 0.75 |
| 42924.064155092594 | 0.75 |
| 42924.06434027778 | 0.75 |
| 42924.06451388889 | 0.75 |
| 42924.06469907407 | 0.75 |
| 42924.06487268519 | 0.75 |
| 42924.065046296295 | 0.75 |
| 42924.06521990741 | 0.75 |
| 42924.065405092595 | 0.69 |
| 42924.0655787037 | 0.69 |
| 42924.06575231482 | 0.75 |
| 42924.06592592593 | 0.75 |
| 42924.066099537034 | 0.75 |
| 42924.06628472222 | 0.75 |
| 42924.066458333335 | 0.69 |
| 42924.066655092596 | 0.69 |
| 42924.06684027778 | 0.75 |
| 42924.06701388889 | 0.69 |
| 42924.0671875 | 0.69 |
| 42924.06736111111 | 0.69 |
| 42924.0675462963 | 0.69 |
| 42924.067719907405 | 0.69 |
| 42924.06789351852 | 0.69 |
| 42924.068090277775 | 0.69 |
| 42924.06827546296 | 0.69 |
| 42924.068449074075 | 0.69 |
| 42924.06862268518 | 0.69 |
| 42924.06880787037 | 0.69 |
| 42924.06898148148 | 0.69 |
| 42924.06915509259 | 0.69 |
| 42924.06932870371 | 0.69 |
| 42924.06952546296 | 0.75 |
| 42924.069710648146 | 0.69 |
| 42924.06988425926 | 0.69 |
| 42924.07005787037 | 0.75 |
| 42924.070231481484 | 0.69 |
| 42924.07041666667 | 0.69 |
| 42924.07059027778 | 0.75 |
| 42924.070763888885 | 0.75 |
| 42924.07094907408 | 0.75 |
| 42924.071122685185 | 0.75 |
| 42924.07129629629 | 0.75 |
| 42924.071493055555 | 0.75 |
| 42924.07167824074 | 0.69 |
| 42924.071851851855 | 0.75 |
| 42924.07202546296 | 0.75 |
| 42924.072222222225 | 0.75 |
| 42924.07240740741 | 0.69 |
| 42924.07258101852 | 0.75 |
| 42924.07275462963 | 0.69 |
| 42924.07292824074 | 0.69 |
| 42924.073113425926 | 0.75 |
| 42924.073287037034 | 0.69 |
| 42924.07346064815 | 0.69 |
| 42924.07365740741 | 0.69 |
| 42924.073842592596 | 0.75 |
| 42924.074016203704 | 0.69 |
| 42924.07418981481 | 0.69 |
| 42924.074375 | 0.69 |
| 42924.07454861111 | 0.69 |
| 42924.07472222222 | 0.69 |
| 42924.074907407405 | 0.69 |
| 42924.07509259259 | 0.69 |
| 42924.075277777774 | 0.69 |
| 42924.07545138889 | 0.69 |
| 42924.075636574074 | 0.69 |
| 42924.07581018518 | 0.69 |
| 42924.0759837963 | 0.69 |
| 42924.076157407406 | 0.69 |
| 42924.07634259259 | 0.69 |
| 42924.076516203706 | 0.69 |
| 42924.076689814814 | 0.69 |
| 42924.076886574076 | 0.69 |
| 42924.07707175926 | 0.69 |
| 42924.07724537037 | 0.69 |
| 42924.077418981484 | 0.69 |
| 42924.07759259259 | 0.69 |
| 42924.07777777778 | 0.69 |
| 42924.07795138889 | 0.69 |
| 42924.078125 | 0.69 |
| 42924.078310185185 | 0.69 |
| 42924.07848379629 | 0.69 |
| 42924.07865740741 | 0.69 |
| 42924.078831018516 | 0.69 |
| 42924.0790162037 | 0.69 |
| 42924.079189814816 | 0.69 |
| 42924.079363425924 | 0.69 |
| 42924.07953703704 | 0.69 |
| 42924.079722222225 | 0.69 |
| 42924.07989583333 | 0.69 |
| 42924.08006944445 | 0.69 |
| 42924.0802662037 | 0.69 |
| 42924.08045138889 | 0.69 |
| 42924.080625 | 0.69 |
| 42924.08079861111 | 0.69 |
| 42924.08099537037 | 0.62 |
| 42924.08118055556 | 0.69 |
| 42924.081354166665 | 0.69 |
| 42924.08152777778 | 0.75 |
| 42924.081724537034 | 0.62 |
| 42924.08190972222 | 0.69 |
| 42924.082083333335 | 0.62 |
| 42924.08225694444 | 0.69 |
| 42924.08244212963 | 0.69 |
| 42924.08261574074 | 0.69 |
| 42924.08278935185 | 0.69 |
| 42924.082962962966 | 0.69 |
| 42924.08314814815 | 0.69 |
| 42924.08332175926 | 0.62 |
| 42924.08349537037 | 0.69 |
| 42924.08366898148 | 0.69 |
| 42924.08385416667 | 0.69 |
| 42924.084027777775 | 0.69 |
| 42924.08420138889 | 0.69 |
| 42924.084398148145 | 0.69 |
| 42924.08458333334 | 0.69 |
| 42924.084756944445 | 0.69 |
| 42924.08493055555 | 0.69 |
| 42924.08511574074 | 0.69 |
| 42924.08528935185 | 0.69 |
| 42924.08546296296 | 0.69 |
| 42924.08563657408 | 0.69 |
| 42924.085810185185 | 0.69 |
| 42924.08599537037 | 0.69 |
| 42924.086168981485 | 0.69 |
| 42924.08634259259 | 0.69 |
| 42924.08652777778 | 0.69 |
| 42924.086701388886 | 0.69 |
| 42924.086875 | 0.69 |
| 42924.08704861111 | 0.69 |
| 42924.087233796294 | 0.69 |
| 42924.08740740741 | 0.69 |
| 42924.08758101852 | 0.69 |
| 42924.0877662037 | 0.69 |
| 42924.08793981482 | 0.69 |
| 42924.088113425925 | 0.69 |
| 42924.08828703704 | 0.69 |
| 42924.088472222225 | 0.69 |
| 42924.08864583333 | 0.69 |
| 42924.08881944444 | 0.69 |
| 42924.08899305556 | 0.69 |
| 42924.08917824074 | 0.69 |
| 42924.08935185185 | 0.62 |
| 42924.089525462965 | 0.69 |
| 42924.08972222222 | 0.69 |
| 42924.089907407404 | 0.69 |
| 42924.09008101852 | 0.69 |
| 42924.09025462963 | 0.69 |
| 42924.09045138889 | 0.62 |
| 42924.090636574074 | 0.69 |
| 42924.09081018518 | 0.69 |
| 42924.0909837963 | 0.69 |
| 42924.091157407405 | 0.69 |
| 42924.09134259259 | 0.69 |
| 42924.091516203705 | 0.62 |
| 42924.09168981481 | 0.62 |
| 42924.091875 | 0.69 |
| 42924.09204861111 | 0.69 |
| 42924.09222222222 | 0.69 |
| 42924.09239583334 | 0.69 |
| 42924.09258101852 | 0.69 |
| 42924.09275462963 | 0.62 |
| 42924.09292824074 | 0.62 |
| 42924.09311342592 | 0.62 |
| 42924.09328703704 | 0.75 |
| 42924.093460648146 | 0.62 |
| 42924.09363425926 | 0.62 |
| 42924.093819444446 | 0.62 |
| 42924.093993055554 | 0.62 |
| 42924.09416666667 | 0.69 |
| 42924.094351851854 | 0.62 |
| 42924.09453703704 | 0.69 |
| 42924.094722222224 | 0.69 |
| 42924.09489583333 | 0.62 |
| 42924.09508101852 | 0.69 |
| 42924.09525462963 | 0.69 |
| 42924.09542824074 | 0.69 |
| 42924.095601851855 | 0.69 |
| 42924.09578703704 | 0.62 |
| 42924.09596064815 | 0.62 |
| 42924.096134259256 | 0.62 |
| 42924.09630787037 | 0.69 |
| 42924.09649305556 | 0.69 |
| 42924.096666666665 | 0.69 |
| 42924.09684027778 | 0.69 |
| 42924.097037037034 | 0.69 |
| 42924.09722222222 | 0.62 |
| 42924.097407407404 | 0.69 |
| 42924.097592592596 | 0.69 |
| 42924.097766203704 | 0.69 |
| 42924.09795138889 | 0.69 |
| 42924.098125 | 0.69 |
| 42924.09829861111 | 0.69 |
| 42924.09847222222 | 0.69 |
| 42924.098645833335 | 0.69 |
| 42924.09883101852 | 0.69 |
| 42924.09900462963 | 0.69 |
| 42924.099178240744 | 0.69 |
| 42924.09935185185 | 0.69 |
| 42924.09953703704 | 0.69 |
| 42924.099710648145 | 0.69 |
| 42924.099907407406 | 0.69 |
| 42924.10010416667 | 0.69 |
| 42924.10028935185 | 0.69 |
| 42924.10046296296 | 0.69 |
| 42924.100636574076 | 0.69 |
| 42924.10082175926 | 0.69 |
| 42924.10099537037 | 0.69 |
| 42924.101168981484 | 0.69 |
| 42924.10135416667 | 0.69 |
| 42924.10152777778 | 0.69 |
| 42924.10170138889 | 0.69 |
| 42924.10189814815 | 0.69 |
| 42924.10209490741 | 0.69 |
| 42924.10225694445 | 0.69 |
| 42924.102430555555 | 0.62 |
| 42924.10260416667 | 0.69 |
| 42924.102789351855 | 0.69 |
| 42924.10296296296 | 0.69 |
| 42924.10313657407 | 0.69 |
| 42924.10333333333 | 0.62 |
| 42924.10351851852 | 0.62 |
| 42924.10369212963 | 0.62 |
| 42924.10386574074 | 0.69 |
| 42924.1040625 | 0.62 |
| 42924.10423611111 | 0.62 |
| 42924.104421296295 | 0.62 |
| 42924.10459490741 | 0.62 |
| 42924.10476851852 | 0.62 |
| 42924.10496527778 | 0.62 |
| 42924.105150462965 | 0.62 |
| 42924.10532407407 | 0.69 |
| 42924.105520833335 | 0.62 |
| 42924.10569444444 | 0.62 |
| 42924.10587962963 | 0.62 |
| 42924.10605324074 | 0.62 |
| 42924.10625 | 0.62 |
| 42924.10643518518 | 0.62 |
| 42924.1066087963 | 0.62 |
| 42924.106782407405 | 0.62 |
| 42924.10697916667 | 0.62 |
| 42924.10716435185 | 0.62 |
| 42924.10733796296 | 0.62 |
| 42924.107511574075 | 0.62 |
| 42924.10770833334 | 0.62 |
| 42924.10789351852 | 0.62 |
| 42924.10806712963 | 0.62 |
| 42924.10824074074 | 0.62 |
| 42924.1084375 | 0.62 |
| 42924.108622685184 | 0.62 |
| 42924.1087962963 | 0.62 |
| 42924.10896990741 | 0.62 |
| 42924.10916666667 | 0.62 |
| 42924.109351851854 | 0.62 |
| 42924.10952546296 | 0.62 |
| 42924.10969907408 | 0.62 |
| 42924.10989583333 | 0.62 |
| 42924.110081018516 | 0.62 |
| 42924.11025462963 | 0.62 |
| 42924.11042824074 | 0.62 |
| 42924.110613425924 | 0.62 |
| 42924.11078703704 | 0.69 |
| 42924.11096064815 | 0.62 |
| 42924.111134259256 | 0.62 |
| 42924.11133101852 | 0.62 |
| 42924.1115162037 | 0.62 |
| 42924.11168981482 | 0.62 |
| 42924.111863425926 | 0.62 |
| 42924.11204861111 | 0.62 |
| 42924.112222222226 | 0.62 |
| 42924.112395833334 | 0.69 |
| 42924.11256944444 | 0.62 |
| 42924.11275462963 | 0.62 |
| 42924.11292824074 | 0.69 |
| 42924.11310185185 | 0.69 |
| 42924.113275462965 | 0.62 |
| 42924.11346064815 | 0.62 |
| 42924.11363425926 | 0.62 |
| 42924.11380787037 | 0.56 |
| 42924.11398148148 | 0.62 |
| 42924.114166666666 | 0.69 |
| 42924.114340277774 | 0.62 |
| 42924.114537037036 | 0.69 |
| 42924.11472222222 | 0.62 |
| 42924.114895833336 | 0.69 |
| 42924.115069444444 | 0.69 |
| 42924.115266203706 | 0.69 |
| 42924.115428240744 | 0.69 |
| 42924.11560185185 | 0.69 |
| 42924.11577546296 | 0.69 |
| 42924.115960648145 | 0.62 |
| 42924.11613425926 | 0.62 |
| 42924.11630787037 | 0.62 |
| 42924.11650462963 | 0.62 |
| 42924.11670138889 | 0.62 |
| 42924.11688657408 | 0.62 |
| 42924.117060185185 | 0.62 |
| 42924.1172337963 | 0.62 |
| 42924.117418981485 | 0.62 |
| 42924.11759259259 | 0.62 |
| 42924.1177662037 | 0.62 |
| 42924.117951388886 | 0.62 |
| 42924.118125 | 0.62 |
| 42924.11829861111 | 0.62 |
| 42924.118472222224 | 0.62 |
| 42924.11865740741 | 0.62 |
| 42924.118842592594 | 0.62 |
| 42924.11902777778 | 0.69 |
| 42924.11920138889 | 0.62 |
| 42924.11938657407 | 0.62 |
| 42924.11956018519 | 0.62 |
| 42924.119733796295 | 0.62 |
| 42924.11993055556 | 0.62 |
| 42924.12011574074 | 0.62 |
| 42924.12028935185 | 0.62 |
| 42924.120462962965 | 0.62 |
| 42924.12063657407 | 0.62 |
| 42924.12082175926 | 0.62 |
| 42924.12099537037 | 0.62 |
| 42924.12116898148 | 0.62 |
| 42924.121342592596 | 0.62 |
| 42924.12152777778 | 0.62 |
| 42924.12170138889 | 0.62 |
| 42924.121875 | 0.62 |
| 42924.12207175926 | 0.62 |
| 42924.12225694444 | 0.62 |
| 42924.12243055556 | 0.62 |
| 42924.12260416667 | 0.62 |
| 42924.12278935185 | 0.62 |
| 42924.12296296296 | 0.62 |
| 42924.123136574075 | 0.62 |
| 42924.12333333334 | 0.62 |
| 42924.12351851852 | 0.62 |
| 42924.123703703706 | 0.62 |
| 42924.12388888889 | 0.62 |
| 42924.124085648145 | 0.62 |
| 42924.12427083333 | 0.62 |
| 42924.124444444446 | 0.62 |
| 42924.12461805555 | 0.62 |
| 42924.12479166667 | 0.62 |
| 42924.124976851854 | 0.62 |
| 42924.12515046296 | 0.62 |
| 42924.12532407408 | 0.62 |
| 42924.12552083333 | 0.62 |
| 42924.125706018516 | 0.62 |
| 42924.12587962963 | 0.62 |
| 42924.12605324074 | 0.62 |
| 42924.12625 | 0.62 |
| 42924.126435185186 | 0.62 |
| 42924.126608796294 | 0.56 |
| 42924.12678240741 | 0.62 |
| 42924.126979166664 | 0.62 |
| 42924.127175925925 | 0.62 |
| 42924.12736111111 | 0.62 |
| 42924.127534722225 | 0.62 |
| 42924.12773148148 | 0.62 |
| 42924.127916666665 | 0.62 |
| 42924.12809027778 | 0.62 |
| 42924.12826388889 | 0.62 |
| 42924.12844907407 | 0.62 |
| 42924.12862268519 | 0.62 |
| 42924.128796296296 | 0.56 |
| 42924.128969907404 | 0.62 |
| 42924.129155092596 | 0.62 |
| 42924.129328703704 | 0.56 |
| 42924.12950231481 | 0.56 |
| 42924.12967592593 | 0.56 |
| 42924.12986111111 | 0.69 |
| 42924.13003472222 | 0.62 |
| 42924.130208333336 | 0.62 |
| 42924.13040509259 | 0.56 |
| 42924.130590277775 | 0.56 |
| 42924.13076388889 | 0.56 |
| 42924.1309375 | 0.56 |
| 42924.13111111111 | 0.62 |
| 42924.1312962963 | 0.56 |
| 42924.13146990741 | 0.69 |
| 42924.13164351852 | 0.56 |
| 42924.131840277776 | 0.62 |
| 42924.13203703704 | 0.56 |
| 42924.13222222222 | 0.62 |
| 42924.13239583333 | 0.56 |
| 42924.13259259259 | 0.56 |
| 42924.13277777778 | 0.56 |
| 42924.13295138889 | 0.56 |
| 42924.133125 | 0.62 |
| 42924.13332175926 | 0.62 |
| 42924.13350694445 | 0.62 |
| 42924.133680555555 | 0.62 |
| 42924.13385416667 | 0.62 |
| 42924.134050925924 | 0.62 |
| 42924.13423611111 | 0.62 |
| 42924.134409722225 | 0.56 |
| 42924.13458333333 | 0.62 |
| 42924.13475694445 | 0.62 |
| 42924.13494212963 | 0.56 |
| 42924.13511574074 | 0.62 |
| 42924.13528935185 | 0.62 |
| 42924.135462962964 | 0.62 |
| 42924.13564814815 | 0.62 |
| 42924.13582175926 | 0.62 |
| 42924.13599537037 | 0.62 |
| 42924.13618055556 | 0.62 |
| 42924.136354166665 | 0.62 |
| 42924.13652777778 | 0.62 |
| 42924.136724537035 | 0.62 |
| 42924.13689814815 | 0.62 |
| 42924.137083333335 | 0.62 |
| 42924.13725694444 | 0.62 |
| 42924.137453703705 | 0.56 |
| 42924.13763888889 | 0.62 |
| 42924.1378125 | 0.62 |
| 42924.13798611111 | 0.62 |
| 42924.13815972222 | 0.62 |
| 42924.138344907406 | 0.62 |
| 42924.13851851852 | 0.62 |
| 42924.13869212963 | 0.62 |
| 42924.138877314814 | 0.62 |
| 42924.13905092593 | 0.62 |
| 42924.13922453704 | 0.62 |
| 42924.139398148145 | 0.62 |
| 42924.13958333333 | 0.62 |
| 42924.139756944445 | 0.62 |
| 42924.13993055555 | 0.62 |
| 42924.14010416667 | 0.62 |
| 42924.14030092592 | 0.62 |
| 42924.14047453704 | 0.62 |
| 42924.14065972222 | 0.62 |
| 42924.14083333333 | 0.62 |
| 42924.141018518516 | 0.62 |
| 42924.14119212963 | 0.62 |
| 42924.141377314816 | 0.62 |
| 42924.1415625 | 0.62 |
| 42924.14175925926 | 0.62 |
| 42924.14194444445 | 0.56 |
| 42924.142118055555 | 0.62 |
| 42924.14229166666 | 0.62 |
| 42924.14246527778 | 0.62 |
| 42924.14265046296 | 0.62 |
| 42924.14282407407 | 0.62 |
| 42924.14299768519 | 0.62 |
| 42924.143171296295 | 0.56 |
| 42924.14335648148 | 0.62 |
| 42924.143530092595 | 0.56 |
| 42924.1437037037 | 0.56 |
| 42924.14388888889 | 0.62 |
| 42924.1440625 | 0.56 |
| 42924.14423611111 | 0.56 |
| 42924.14443287037 | 0.56 |
| 42924.14461805556 | 0.62 |
| 42924.144791666666 | 0.62 |
| 42924.14496527778 | 0.56 |
| 42924.145162037035 | 0.56 |
| 42924.14534722222 | 0.56 |
| 42924.145520833335 | 0.56 |
| 42924.14569444444 | 0.62 |
| 42924.14586805556 | 0.56 |
| 42924.146053240744 | 0.56 |
| 42924.14622685185 | 0.56 |
| 42924.14640046296 | 0.56 |
| 42924.146585648145 | 0.56 |
| 42924.14675925926 | 0.56 |
| 42924.14693287037 | 0.56 |
| 42924.14710648148 | 0.56 |
| 42924.14729166667 | 0.56 |
| 42924.147465277776 | 0.56 |
| 42924.14763888889 | 0.56 |
| 42924.147835648146 | 0.56 |
| 42924.14800925926 | 0.56 |
| 42924.148194444446 | 0.56 |
| 42924.148368055554 | 0.56 |
| 42924.14854166667 | 0.56 |
| 42924.148726851854 | 0.56 |
| 42924.14890046296 | 0.62 |
| 42924.14907407408 | 0.62 |
| 42924.149247685185 | 0.56 |
| 42924.14942129629 | 0.62 |
| 42924.14959490741 | 0.62 |
| 42924.14979166666 | 0.62 |
| 42924.1499537037 | 0.56 |
| 42924.15012731482 | 0.56 |
| 42924.15032407407 | 0.62 |
| 42924.15049768519 | 0.62 |
| 42924.15068287037 | 0.56 |
| 42924.15085648148 | 0.56 |
| 42924.151041666664 | 0.62 |
| 42924.15121527778 | 0.56 |
| 42924.15138888889 | 0.62 |
| 42924.1515625 | 0.62 |
| 42924.15174768519 | 0.62 |
| 42924.151921296296 | 0.62 |
| 42924.152094907404 | 0.62 |
| 42924.152291666665 | 0.62 |
| 42924.15247685185 | 0.62 |
| 42924.152650462966 | 0.62 |
| 42924.15282407407 | 0.62 |
| 42924.15299768518 | 0.62 |
| 42924.153182870374 | 0.62 |
| 42924.15335648148 | 0.62 |
| 42924.15353009259 | 0.62 |
| 42924.15372685185 | 0.62 |
| 42924.153912037036 | 0.62 |
| 42924.15408564815 | 0.62 |
| 42924.15425925926 | 0.62 |
| 42924.15445601852 | 0.62 |
| 42924.154641203706 | 0.62 |
| 42924.154814814814 | 0.62 |
| 42924.15498842593 | 0.62 |
| 42924.155173611114 | 0.62 |
| 42924.15534722222 | 0.62 |
| 42924.15552083333 | 0.56 |
| 42924.155694444446 | 0.62 |
| 42924.15587962963 | 0.62 |
| 42924.15605324074 | 0.62 |
| 42924.156226851854 | 0.62 |
| 42924.15640046296 | 0.56 |
| 42924.15658564815 | 0.56 |
| 42924.15675925926 | 0.62 |
| 42924.15693287037 | 0.62 |
| 42924.15710648148 | 0.62 |
| 42924.15729166667 | 0.56 |
| 42924.15746527778 | 0.62 |
| 42924.157638888886 | 0.56 |
| 42924.1578125 | 0.62 |
| 42924.157997685186 | 0.62 |
| 42924.158171296294 | 0.62 |
| 42924.15834490741 | 0.56 |
| 42924.158541666664 | 0.62 |
| 42924.15872685185 | 0.62 |
| 42924.158900462964 | 0.56 |
| 42924.15907407407 | 0.56 |
| 42924.159270833334 | 0.56 |
| 42924.15945601852 | 0.56 |
| 42924.15962962963 | 0.56 |
| 42924.15980324074 | 0.62 |
| 42924.16 | 0.56 |
| 42924.16018518519 | 0.56 |
| 42924.160358796296 | 0.56 |
| 42924.160532407404 | 0.56 |
| 42924.160729166666 | 0.56 |
| 42924.16092592593 | 0.56 |
| 42924.16111111111 | 0.56 |
| 42924.16128472222 | 0.56 |
| 42924.161458333336 | 0.56 |
| 42924.16164351852 | 0.56 |
| 42924.16181712963 | 0.62 |
| 42924.161990740744 | 0.56 |
| 42924.1621875 | 0.56 |
| 42924.16237268518 | 0.56 |
| 42924.1625462963 | 0.56 |
| 42924.16271990741 | 0.56 |
| 42924.16291666667 | 0.56 |
| 42924.16310185185 | 0.56 |
| 42924.16328703704 | 0.56 |
| 42924.16347222222 | 0.56 |
| 42924.16364583333 | 0.56 |
| 42924.163831018515 | 0.56 |
| 42924.16400462963 | 0.56 |
| 42924.16417824074 | 0.56 |
| 42924.164375 | 0.56 |
| 42924.164560185185 | 0.56 |
| 42924.16473379629 | 0.56 |
| 42924.16490740741 | 0.56 |
| 42924.16508101852 | 0.56 |
| 42924.1652662037 | 0.56 |
| 42924.16543981482 | 0.56 |
| 42924.165613425925 | 0.56 |
| 42924.165810185186 | 0.56 |
| 42924.16599537037 | 0.56 |
| 42924.16616898148 | 0.56 |
| 42924.166342592594 | 0.56 |
| 42924.16652777778 | 0.56 |
| 42924.166712962964 | 0.56 |
| 42924.16689814815 | 0.56 |
| 42924.16707175926 | 0.56 |
| 42924.16725694444 | 0.56 |
| 42924.16743055556 | 0.62 |
| 42924.167604166665 | 0.62 |
| 42924.16777777778 | 0.56 |
| 42924.167962962965 | 0.62 |
| 42924.16814814815 | 0.56 |
| 42924.168333333335 | 0.56 |
| 42924.16850694444 | 0.56 |
| 42924.16869212963 | 0.56 |
| 42924.16886574074 | 0.56 |
| 42924.16903935185 | 0.62 |
| 42924.16923611111 | 0.62 |
| 42924.1694212963 | 0.56 |
| 42924.169594907406 | 0.62 |
| 42924.16976851852 | 0.56 |
| 42924.169953703706 | 0.56 |
| 42924.170127314814 | 0.62 |
| 42924.17030092593 | 0.62 |
| 42924.17049768518 | 0.56 |
| 42924.17068287037 | 0.56 |
| 42924.17085648148 | 0.56 |
| 42924.17103009259 | 0.62 |
| 42924.17120370371 | 0.62 |
| 42924.17138888889 | 0.56 |
| 42924.1715625 | 0.56 |
| 42924.17173611111 | 0.62 |
| 42924.17193287037 | 0.56 |
| 42924.172118055554 | 0.62 |
| 42924.17229166667 | 0.62 |
| 42924.17246527778 | 0.62 |
| 42924.17265046296 | 0.62 |
| 42924.17282407408 | 0.62 |
| 42924.172997685186 | 0.56 |
| 42924.173171296294 | 0.56 |
| 42924.17335648148 | 0.56 |
| 42924.173530092594 | 0.62 |
| 42924.1737037037 | 0.62 |
| 42924.17387731482 | 0.56 |
| 42924.1740625 | 0.62 |
| 42924.17423611111 | 0.62 |
| 42924.174409722225 | 0.56 |
| 42924.17460648148 | 0.56 |
| 42924.174791666665 | 0.56 |
| 42924.17496527778 | 0.56 |
| 42924.17513888889 | 0.56 |
| 42924.17533564815 | 0.56 |
| 42924.175520833334 | 0.56 |
| 42924.17569444444 | 0.56 |
| 42924.17586805556 | 0.56 |
| 42924.17606481481 | 0.56 |
| 42924.17625 | 0.56 |
| 42924.17642361111 | 0.56 |
| 42924.17659722222 | 0.56 |
| 42924.176770833335 | 0.56 |
| 42924.17695601852 | 0.56 |
| 42924.177141203705 | 0.62 |
| 42924.17732638889 | 0.56 |
| 42924.1775 | 0.56 |
| 42924.17768518518 | 0.56 |
| 42924.1778587963 | 0.56 |
| 42924.178032407406 | 0.56 |
| 42924.17822916667 | 0.56 |
| 42924.17841435185 | 0.56 |
| 42924.17858796296 | 0.56 |
| 42924.178761574076 | 0.56 |
| 42924.17894675926 | 0.56 |
| 42924.17912037037 | 0.56 |
| 42924.179293981484 | 0.56 |
| 42924.17946759259 | 0.56 |
| 42924.17965277778 | 0.56 |
| 42924.17982638889 | 0.56 |
| 42924.18 | 0.56 |
| 42924.180185185185 | 0.56 |
| 42924.18035879629 | 0.56 |
| 42924.18053240741 | 0.56 |
| 42924.18070601852 | 0.56 |
| 42924.1808912037 | 0.56 |
| 42924.18106481482 | 0.56 |
| 42924.181238425925 | 0.56 |
| 42924.18141203704 | 0.56 |
| 42924.181597222225 | 0.56 |
| 42924.18177083333 | 0.56 |
| 42924.18194444444 | 0.56 |
| 42924.18212962963 | 0.56 |
| 42924.18230324074 | 0.56 |
| 42924.18247685185 | 0.56 |
| 42924.182650462964 | 0.56 |
| 42924.18283564815 | 0.56 |
| 42924.18300925926 | 0.56 |
| 42924.18318287037 | 0.56 |
| 42924.18337962963 | 0.56 |
| 42924.18356481481 | 0.56 |
| 42924.18373842593 | 0.56 |
| 42924.183912037035 | 0.56 |
| 42924.1841087963 | 0.56 |
| 42924.18430555556 | 0.56 |
| 42924.18449074074 | 0.56 |
| 42924.18466435185 | 0.56 |
| 42924.18486111111 | 0.56 |
| 42924.18505787037 | 0.56 |
| 42924.185219907406 | 0.56 |
| 42924.18539351852 | 0.56 |
| 42924.18556712963 | 0.56 |
| 42924.185752314814 | 0.56 |
| 42924.18592592593 | 0.62 |
| 42924.18609953704 | 0.56 |
| 42924.1862962963 | 0.56 |
| 42924.18645833333 | 0.56 |
| 42924.186631944445 | 0.56 |
| 42924.18680555555 | 0.56 |
| 42924.18699074074 | 0.56 |
| 42924.18716435185 | 0.56 |
| 42924.18733796296 | 0.56 |
| 42924.18751157408 | 0.56 |
| 42924.18769675926 | 0.62 |
| 42924.18787037037 | 0.56 |
| 42924.188043981485 | 0.56 |
| 42924.18824074074 | 0.56 |
| 42924.188425925924 | 0.56 |
| 42924.18859953704 | 0.56 |
| 42924.18877314815 | 0.56 |
| 42924.18894675926 | 0.5 |
| 42924.18913194445 | 0.62 |
| 42924.189305555556 | 0.56 |
| 42924.189479166664 | 0.56 |
| 42924.18966435185 | 0.62 |
| 42924.189837962964 | 0.5 |
| 42924.19001157407 | 0.56 |
| 42924.19020833333 | 0.5 |
| 42924.19039351852 | 0.56 |
| 42924.190567129626 | 0.56 |
| 42924.19074074074 | 0.56 |
| 42924.19092592593 | 0.56 |
| 42924.191099537034 | 0.5 |
| 42924.19127314815 | 0.62 |
| 42924.19144675926 | 0.56 |
| 42924.19163194444 | 0.56 |
| 42924.19180555556 | 0.56 |
| 42924.191979166666 | 0.5 |
| 42924.19216435185 | 0.56 |
| 42924.192337962966 | 0.62 |
| 42924.192511574074 | 0.5 |
| 42924.19268518518 | 0.56 |
| 42924.19287037037 | 0.56 |
| 42924.19304398148 | 0.56 |
| 42924.19321759259 | 0.56 |
| 42924.19341435185 | 0.56 |
| 42924.19359953704 | 0.56 |
| 42924.193773148145 | 0.56 |
| 42924.19394675926 | 0.56 |
| 42924.194131944445 | 0.56 |
| 42924.19430555555 | 0.56 |
| 42924.19447916667 | 0.56 |
| 42924.19467592592 | 0.62 |
| 42924.194861111115 | 0.56 |
| 42924.19503472222 | 0.56 |
| 42924.19521990741 | 0.56 |
| 42924.19540509259 | 0.56 |
| 42924.19559027778 | 0.56 |
| 42924.195763888885 | 0.56 |
| 42924.1959375 | 0.56 |
| 42924.19611111111 | 0.56 |
| 42924.19629629629 | 0.56 |
| 42924.19646990741 | 0.56 |
| 42924.19664351852 | 0.56 |
| 42924.19684027778 | 0.56 |
| 42924.19702546296 | 0.56 |
| 42924.19719907407 | 0.56 |
| 42924.19737268519 | 0.56 |
| 42924.197546296295 | 0.56 |
| 42924.19773148148 | 0.56 |
| 42924.197905092595 | 0.56 |
| 42924.1980787037 | 0.56 |
| 42924.19826388889 | 0.56 |
| 42924.1984375 | 0.56 |
| 42924.19861111111 | 0.56 |
| 42924.19878472222 | 0.56 |
| 42924.198969907404 | 0.56 |
| 42924.19914351852 | 0.56 |
| 42924.19931712963 | 0.56 |
| 42924.19951388889 | 0.56 |
| 42924.19969907407 | 0.56 |
| 42924.19987268518 | 0.56 |
| 42924.2000462963 | 0.56 |
| 42924.20023148148 | 0.56 |
| 42924.20040509259 | 0.56 |
| 42924.200578703705 | 0.56 |
| 42924.20077546296 | 0.56 |
| 42924.20096064815 | 0.56 |
| 42924.20113425926 | 0.56 |
| 42924.20130787037 | 0.56 |
| 42924.20148148148 | 0.56 |
| 42924.20166666667 | 0.56 |
| 42924.201840277776 | 0.56 |
| 42924.20201388889 | 0.56 |
| 42924.2021875 | 0.56 |
| 42924.202372685184 | 0.56 |
| 42924.2025462963 | 0.56 |
| 42924.20271990741 | 0.56 |
| 42924.202893518515 | 0.56 |
| 42924.2030787037 | 0.56 |
| 42924.203252314815 | 0.56 |
| 42924.20344907408 | 0.56 |
| 42924.20363425926 | 0.56 |
| 42924.20380787037 | 0.56 |
| 42924.20398148148 | 0.56 |
| 42924.20417824074 | 0.56 |
| 42924.204363425924 | 0.56 |
| 42924.20454861111 | 0.56 |
| 42924.204733796294 | 0.56 |
| 42924.20490740741 | 0.56 |
| 42924.205104166664 | 0.56 |
| 42924.2052662037 | 0.5 |
| 42924.20543981482 | 0.56 |
| 42924.205613425926 | 0.56 |
| 42924.20579861111 | 0.62 |
| 42924.205972222226 | 0.56 |
| 42924.206145833334 | 0.56 |
| 42924.206342592595 | 0.5 |
| 42924.20652777778 | 0.56 |
| 42924.20670138889 | 0.56 |
| 42924.206875 | 0.56 |
| 42924.20704861111 | 0.56 |
| 42924.207233796296 | 0.56 |
| 42924.207407407404 | 0.5 |
| 42924.20758101852 | 0.5 |
| 42924.20775462963 | 0.5 |
| 42924.20792824074 | 0.62 |
| 42924.20810185185 | 0.5 |
| 42924.20827546297 | 0.5 |
| 42924.208449074074 | 0.56 |
| 42924.20863425926 | 0.56 |
| 42924.20880787037 | 0.56 |
| 42924.20898148148 | 0.5 |
| 42924.20916666667 | 0.56 |
| 42924.209340277775 | 0.5 |
| 42924.20951388889 | 0.56 |
| 42924.209710648145 | 0.56 |
| 42924.20989583333 | 0.5 |
| 42924.210069444445 | 0.56 |
| 42924.21024305555 | 0.56 |
| 42924.210439814815 | 0.56 |
| 42924.210625 | 0.5 |
| 42924.21079861111 | 0.5 |
| 42924.21097222222 | 0.62 |
| 42924.211168981485 | 0.5 |
| 42924.21135416667 | 0.56 |
| 42924.21152777778 | 0.56 |
| 42924.211701388886 | 0.56 |
| 42924.21189814815 | 0.5 |
| 42924.21208333333 | 0.5 |
| 42924.21225694445 | 0.5 |
| 42924.212430555555 | 0.5 |
| 42924.21260416666 | 0.56 |
| 42924.212789351855 | 0.56 |
| 42924.21296296296 | 0.5 |
| 42924.213159722225 | 0.56 |
| 42924.21334490741 | 0.56 |
| 42924.21351851852 | 0.56 |
| 42924.213692129626 | 0.56 |
| 42924.21387731482 | 0.56 |
| 42924.214050925926 | 0.56 |
| 42924.214224537034 | 0.56 |
| 42924.21439814815 | 0.5 |
| 42924.214594907404 | 0.56 |
| 42924.214780092596 | 0.56 |
| 42924.214953703704 | 0.56 |
| 42924.21512731481 | 0.56 |
| 42924.2153125 | 0.56 |
| 42924.21548611111 | 0.56 |
| 42924.21565972222 | 0.56 |
| 42924.21585648148 | 0.56 |
| 42924.21604166667 | 0.56 |
| 42924.216215277775 | 0.56 |
| 42924.21638888889 | 0.56 |
| 42924.21658564815 | 0.56 |
| 42924.21674768518 | 0.56 |
| 42924.2169212963 | 0.56 |
| 42924.217094907406 | 0.56 |
| 42924.21728009259 | 0.56 |
| 42924.217465277776 | 0.56 |
| 42924.21763888889 | 0.56 |
| 42924.217824074076 | 0.56 |
| 42924.217997685184 | 0.56 |
| 42924.2181712963 | 0.56 |
| 42924.21834490741 | 0.56 |
| 42924.21853009259 | 0.56 |
| 42924.2187037037 | 0.56 |
| 42924.218877314815 | 0.56 |
| 42924.21907407408 | 0.56 |
| 42924.21925925926 | 0.56 |
| 42924.21943287037 | 0.56 |
| 42924.21960648148 | 0.56 |
| 42924.21979166667 | 0.56 |
| 42924.21996527778 | 0.56 |
| 42924.220138888886 | 0.56 |
| 42924.2203125 | 0.56 |
| 42924.220497685186 | 0.56 |
| 42924.22068287037 | 0.56 |
| 42924.22085648148 | 0.56 |
| 42924.221030092594 | 0.56 |
| 42924.22121527778 | 0.5 |
| 42924.22138888889 | 0.5 |
| 42924.2215625 | 0.5 |
| 42924.22175925926 | 0.56 |
| 42924.22194444444 | 0.5 |
| 42924.22211805556 | 0.56 |
| 42924.222291666665 | 0.56 |
| 42924.22248842593 | 0.56 |
| 42924.22267361111 | 0.5 |
| 42924.22284722222 | 0.56 |
| 42924.223020833335 | 0.56 |
| 42924.22321759259 | 0.5 |
| 42924.22340277778 | 0.5 |
| 42924.22357638889 | 0.5 |
| 42924.22375 | 0.5 |
| 42924.22393518518 | 0.5 |
| 42924.2241087963 | 0.5 |
| 42924.224282407406 | 0.56 |
| 42924.22445601852 | 0.5 |
| 42924.224641203706 | 0.56 |
| 42924.224814814814 | 0.56 |
| 42924.22498842593 | 0.5 |
| 42924.225173611114 | 0.56 |
| 42924.22534722222 | 0.56 |
| 42924.22552083333 | 0.5 |
| 42924.225694444445 | 0.56 |
| 42924.22587962963 | 0.5 |
| 42924.22605324074 | 0.5 |
| 42924.22622685185 | 0.5 |
| 42924.22642361111 | 0.5 |
| 42924.2266087963 | 0.5 |
| 42924.22678240741 | 0.5 |
| 42924.226956018516 | 0.5 |
| 42924.22715277778 | 0.5 |
| 42924.22733796296 | 0.5 |
| 42924.22751157408 | 0.5 |
| 42924.227685185186 | 0.5 |
| 42924.22788194445 | 0.5 |
| 42924.22806712963 | 0.5 |
| 42924.22824074074 | 0.5 |
| 42924.228414351855 | 0.56 |
| 42924.22861111111 | 0.5 |
| 42924.228796296295 | 0.5 |
| 42924.22896990741 | 0.5 |
| 42924.22914351852 | 0.5 |
| 42924.229317129626 | 0.5 |
| 42924.22950231482 | 0.5 |
| 42924.229675925926 | 0.56 |
| 42924.229849537034 | 0.5 |
| 42924.23003472222 | 0.5 |
| 42924.230208333334 | 0.5 |
| 42924.23038194444 | 0.5 |
| 42924.23055555556 | 0.56 |
| 42924.23074074074 | 0.56 |
| 42924.23091435185 | 0.56 |
| 42924.231099537035 | 0.56 |
| 42924.23127314815 | 0.5 |
| 42924.231458333335 | 0.5 |
| 42924.23163194444 | 0.5 |
| 42924.23180555556 | 0.56 |
| 42924.23200231481 | 0.5 |
| 42924.2321875 | 0.56 |
| 42924.23236111111 | 0.56 |
| 42924.23253472222 | 0.56 |
| 42924.23270833334 | 0.56 |
| 42924.23289351852 | 0.56 |
| 42924.23306712963 | 0.56 |
| 42924.23324074074 | 0.56 |
| 42924.23341435185 | 0.56 |
| 42924.23359953704 | 0.5 |
| 42924.233773148146 | 0.56 |
| 42924.23394675926 | 0.56 |
| 42924.23412037037 | 0.56 |
| 42924.234305555554 | 0.56 |
| 42924.23447916667 | 0.56 |
| 42924.234664351854 | 0.56 |
| 42924.23483796296 | 0.56 |
| 42924.23501157408 | 0.56 |
| 42924.235185185185 | 0.56 |
| 42924.23537037037 | 0.56 |